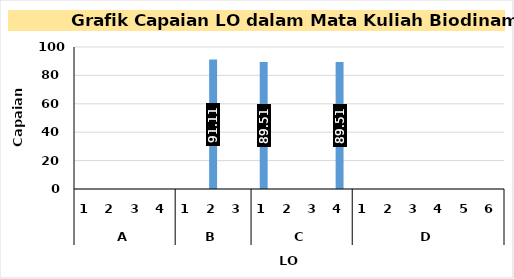
| Category | Series 0 |
|---|---|
| 0 | 0 |
| 1 | 0 |
| 2 | 0 |
| 3 | 0 |
| 4 | 0 |
| 5 | 91.111 |
| 6 | 0 |
| 7 | 89.511 |
| 8 | 0 |
| 9 | 0 |
| 10 | 89.511 |
| 11 | 0 |
| 12 | 0 |
| 13 | 0 |
| 14 | 0 |
| 15 | 0 |
| 16 | 0 |